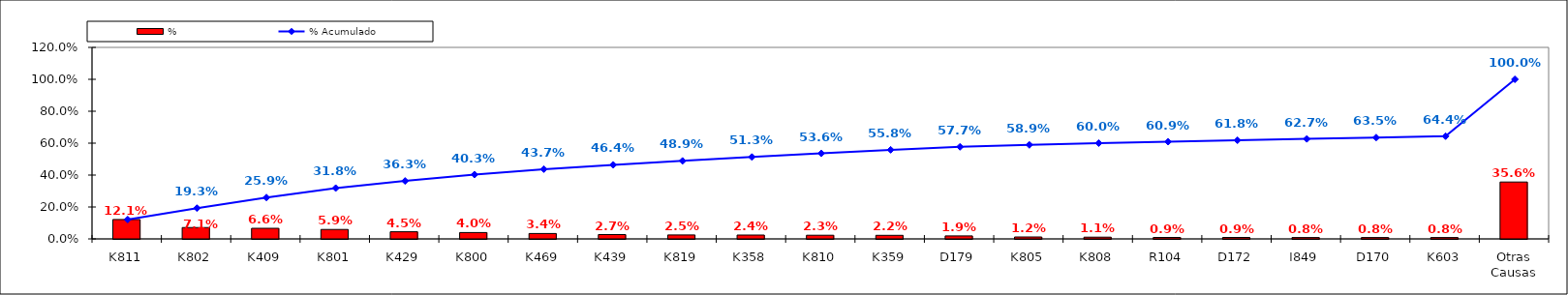
| Category | % |
|---|---|
| K811 | 0.121 |
| K802 | 0.071 |
| K409 | 0.066 |
| K801 | 0.059 |
| K429 | 0.045 |
| K800 | 0.04 |
| K469 | 0.034 |
| K439 | 0.027 |
| K819 | 0.025 |
| K358 | 0.024 |
| K810 | 0.023 |
| K359 | 0.022 |
| D179 | 0.019 |
| K805 | 0.012 |
| K808 | 0.011 |
| R104 | 0.009 |
| D172 | 0.009 |
| I849 | 0.008 |
| D170 | 0.008 |
| K603 | 0.008 |
| Otras Causas | 0.356 |